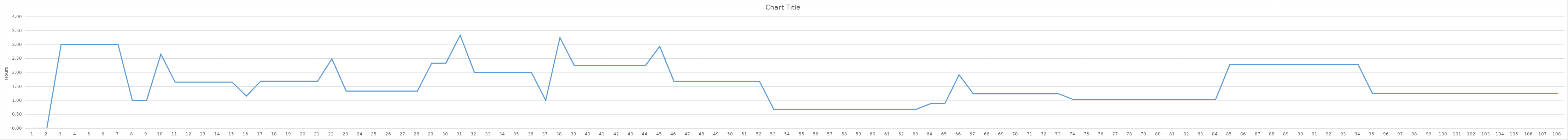
| Category | Series 0 |
|---|---|
| 0 | 0 |
| 1 | 0 |
| 2 | 3 |
| 3 | 3 |
| 4 | 3 |
| 5 | 3 |
| 6 | 3 |
| 7 | 1 |
| 8 | 1 |
| 9 | 2.654 |
| 10 | 1.654 |
| 11 | 1.654 |
| 12 | 1.654 |
| 13 | 1.654 |
| 14 | 1.654 |
| 15 | 1.154 |
| 16 | 1.687 |
| 17 | 1.687 |
| 18 | 1.687 |
| 19 | 1.687 |
| 20 | 1.687 |
| 21 | 2.487 |
| 22 | 1.333 |
| 23 | 1.333 |
| 24 | 1.333 |
| 25 | 1.333 |
| 26 | 1.333 |
| 27 | 1.333 |
| 28 | 2.333 |
| 29 | 2.333 |
| 30 | 3.333 |
| 31 | 2 |
| 32 | 2 |
| 33 | 2 |
| 34 | 2 |
| 35 | 2 |
| 36 | 1 |
| 37 | 3.25 |
| 38 | 2.25 |
| 39 | 2.25 |
| 40 | 2.25 |
| 41 | 2.25 |
| 42 | 2.25 |
| 43 | 2.25 |
| 44 | 2.932 |
| 45 | 1.682 |
| 46 | 1.682 |
| 47 | 1.682 |
| 48 | 1.682 |
| 49 | 1.682 |
| 50 | 1.682 |
| 51 | 1.682 |
| 52 | 0.682 |
| 53 | 0.682 |
| 54 | 0.682 |
| 55 | 0.682 |
| 56 | 0.682 |
| 57 | 0.682 |
| 58 | 0.682 |
| 59 | 0.682 |
| 60 | 0.682 |
| 61 | 0.682 |
| 62 | 0.682 |
| 63 | 0.882 |
| 64 | 0.882 |
| 65 | 1.916 |
| 66 | 1.234 |
| 67 | 1.234 |
| 68 | 1.234 |
| 69 | 1.234 |
| 70 | 1.234 |
| 71 | 1.234 |
| 72 | 1.234 |
| 73 | 1.034 |
| 74 | 1.034 |
| 75 | 1.034 |
| 76 | 1.034 |
| 77 | 1.034 |
| 78 | 1.034 |
| 79 | 1.034 |
| 80 | 1.034 |
| 81 | 1.034 |
| 82 | 1.034 |
| 83 | 1.034 |
| 84 | 2.284 |
| 85 | 2.284 |
| 86 | 2.284 |
| 87 | 2.284 |
| 88 | 2.284 |
| 89 | 2.284 |
| 90 | 2.284 |
| 91 | 2.284 |
| 92 | 2.284 |
| 93 | 2.284 |
| 94 | 1.25 |
| 95 | 1.25 |
| 96 | 1.25 |
| 97 | 1.25 |
| 98 | 1.25 |
| 99 | 1.25 |
| 100 | 1.25 |
| 101 | 1.25 |
| 102 | 1.25 |
| 103 | 1.25 |
| 104 | 1.25 |
| 105 | 1.25 |
| 106 | 1.25 |
| 107 | 1.25 |